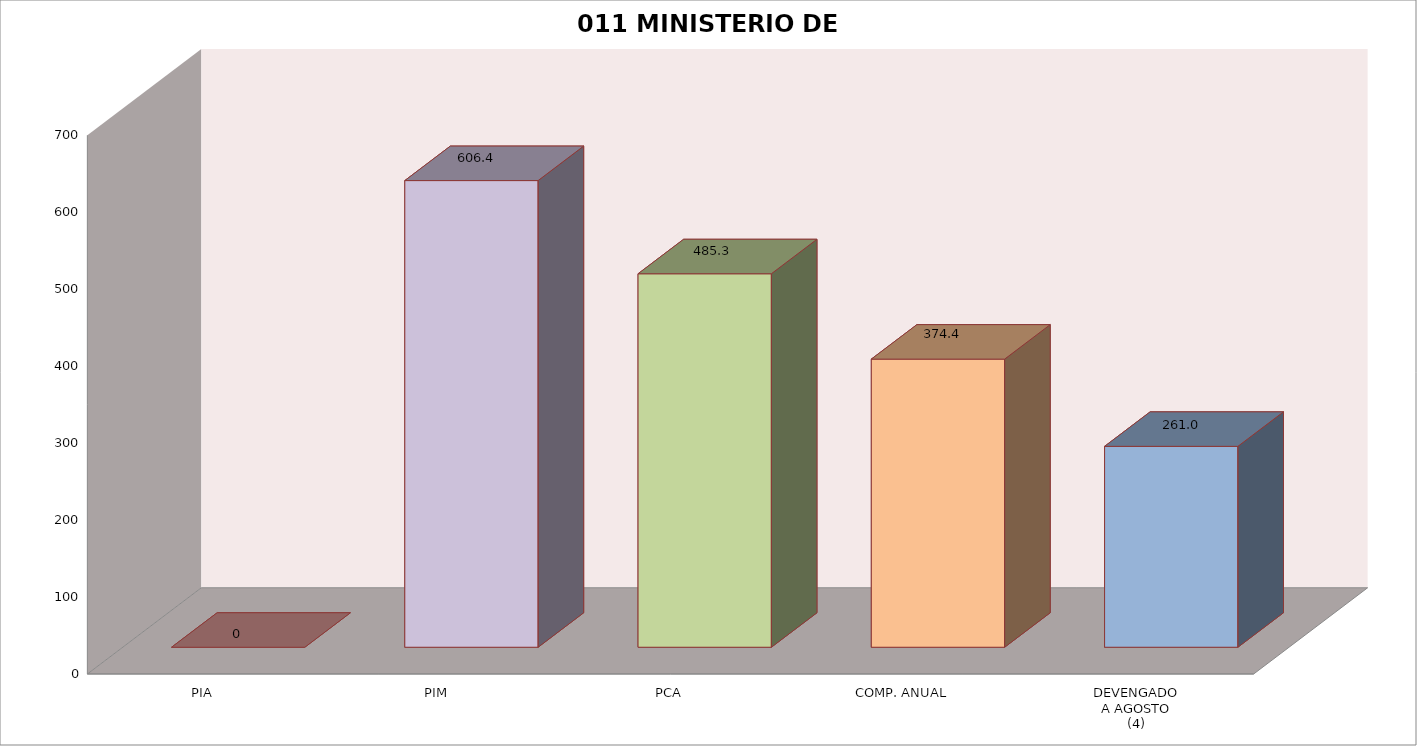
| Category | 011 MINISTERIO DE SALUD |
|---|---|
| PIA | 0 |
| PIM | 606.36 |
| PCA | 485.267 |
| COMP. ANUAL | 374.358 |
| DEVENGADO
A AGOSTO
(4) | 261.03 |